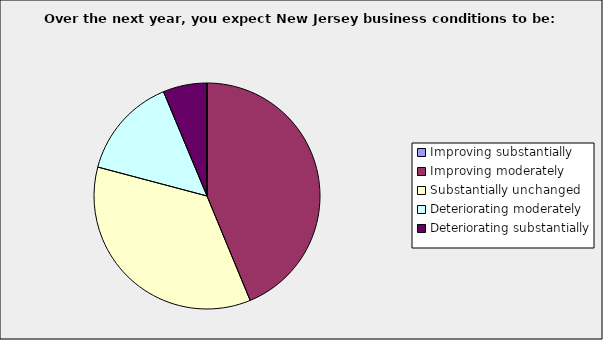
| Category | Series 0 |
|---|---|
| Improving substantially | 0 |
| Improving moderately | 0.438 |
| Substantially unchanged | 0.354 |
| Deteriorating moderately | 0.146 |
| Deteriorating substantially | 0.063 |